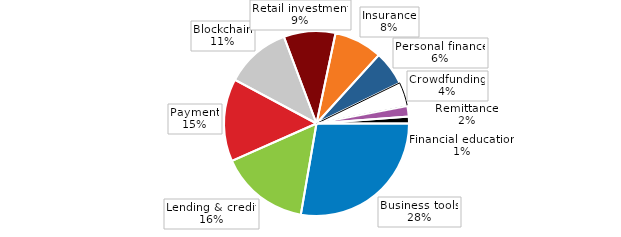
| Category | Series 0 |
|---|---|
| Business tools | 27.711 |
| Lending & credit | 15.663 |
| Payment | 14.458 |
| Blockchain | 11.446 |
| Retail investment | 9.036 |
| Insurance | 8.434 |
| Personal finance | 6.024 |
| Crowdfunding | 4.217 |
| Remittance | 1.807 |
| Financial education | 1.205 |